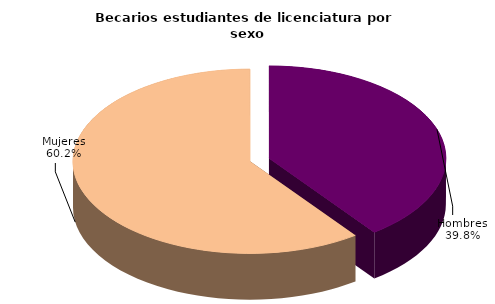
| Category | Series 0 |
|---|---|
| Hombres | 33467 |
| Mujeres | 50522 |